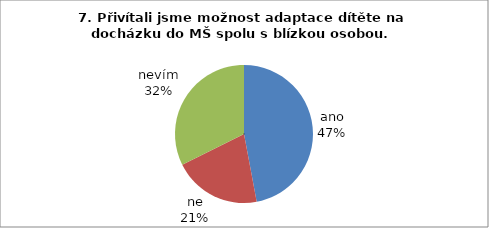
| Category | 7. |
|---|---|
| ano | 16 |
| ne | 7 |
| nevím | 11 |